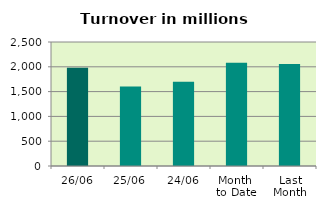
| Category | Series 0 |
|---|---|
| 26/06 | 1981.12 |
| 25/06 | 1602.15 |
| 24/06 | 1699.364 |
| Month 
to Date | 2081.205 |
| Last
Month | 2056.808 |